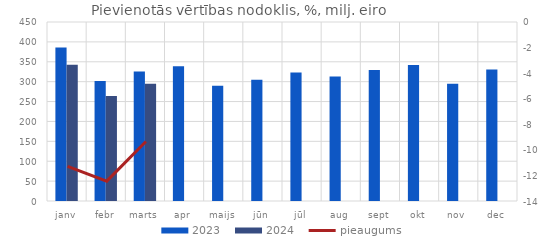
| Category | 2023 | 2024 |
|---|---|---|
| janv | 386.11 | 342.506 |
| febr | 301.806 | 264.233 |
| marts | 325.432 | 295.025 |
| apr | 338.499 | 0 |
| maijs | 289.733 | 0 |
| jūn | 305.091 | 0 |
| jūl | 323.284 | 0 |
| aug | 312.936 | 0 |
| sept | 329.266 | 0 |
| okt | 341.811 | 0 |
| nov | 294.749 | 0 |
| dec | 330.799 | 0 |